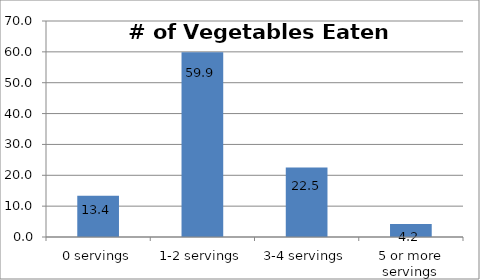
| Category | Series 0 |
|---|---|
| 0 servings | 13.351 |
| 1-2 servings | 59.9 |
| 3-4 servings | 22.542 |
| 5 or more servings | 4.208 |